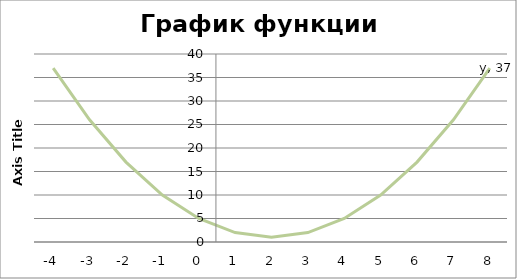
| Category | y |
|---|---|
| -4.0 | 37 |
| -3.0 | 26 |
| -2.0 | 17 |
| -1.0 | 10 |
| 0.0 | 5 |
| 1.0 | 2 |
| 2.0 | 1 |
| 3.0 | 2 |
| 4.0 | 5 |
| 5.0 | 10 |
| 6.0 | 17 |
| 7.0 | 26 |
| 8.0 | 37 |